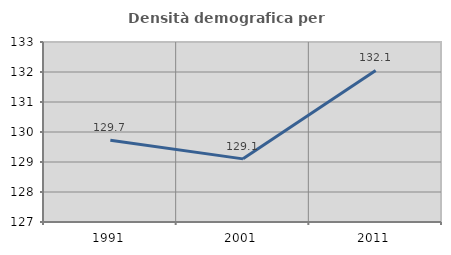
| Category | Densità demografica |
|---|---|
| 1991.0 | 129.728 |
| 2001.0 | 129.105 |
| 2011.0 | 132.054 |